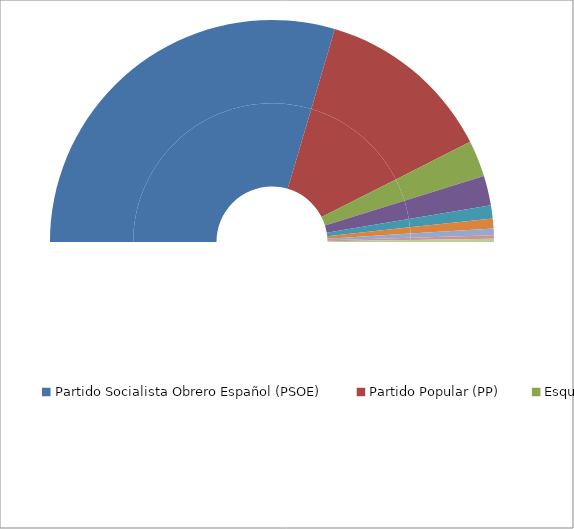
| Category | Series 0 | Series 1 |
|---|---|---|
| Partido Socialista Obrero Español (PSOE) | 123 | 59.135 |
| Partido Popular (PP) | 54 | 25.962 |
| Esquerra Republicana de Catalunya-Sobiranistes (ERC-SOBIRANISTES) | 11 | 5.288 |
| Euzko Alderdi Jetzalea-Partido Nacionalista Vasco (EAJ-PNV) | 9 | 4.327 |
| Ciudadanos-Partido de la Ciudadanía (C's) | 4 | 1.923 |
| Navarra Suma (NA+) | 3 | 1.442 |
| Junts per Catalunya-Junts (JxCAT-JUNTS) | 2 | 0.962 |
| Euskal Herria Bildu (EH Bildu) | 1 | 0.481 |
| Agrupación Socialista Gomera (ASG) | 1 | 0.481 |